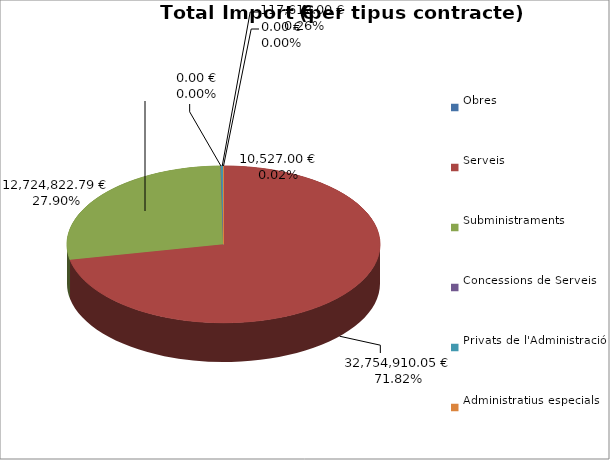
| Category | Total preu
(amb IVA) |
|---|---|
| Obres | 10527 |
| Serveis | 32754910.05 |
| Subministraments | 12724822.79 |
| Concessions de Serveis | 0 |
| Privats de l'Administració | 117612 |
| Administratius especials | 0 |